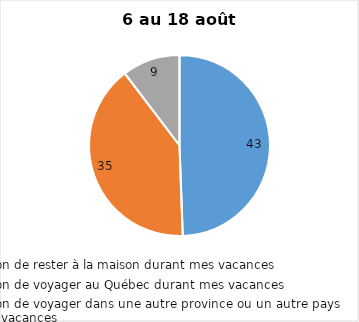
| Category | Series 0 |
|---|---|
| J’ai l’intention de rester à la maison durant mes vacances | 43 |
| J’ai l’intention de voyager au Québec durant mes vacances | 35 |
| J’ai l’intention de voyager dans une autre province ou un autre pays durant mes vacances | 9 |